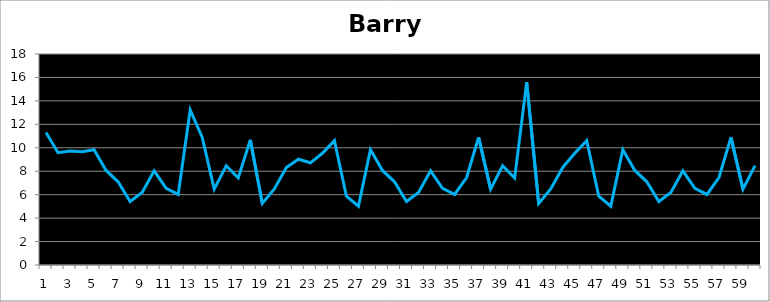
| Category | Barry |
|---|---|
| 0 | 11.312 |
| 1 | 9.582 |
| 2 | 9.734 |
| 3 | 9.655 |
| 4 | 9.84 |
| 5 | 8.066 |
| 6 | 7.099 |
| 7 | 5.417 |
| 8 | 6.193 |
| 9 | 8.037 |
| 10 | 6.54 |
| 11 | 6.018 |
| 12 | 13.222 |
| 13 | 10.888 |
| 14 | 6.469 |
| 15 | 8.474 |
| 16 | 7.427 |
| 17 | 10.676 |
| 18 | 5.253 |
| 19 | 6.486 |
| 20 | 8.319 |
| 21 | 9.023 |
| 22 | 8.718 |
| 23 | 9.53 |
| 24 | 10.608 |
| 25 | 5.869 |
| 26 | 5.018 |
| 27 | 9.84 |
| 28 | 8.066 |
| 29 | 7.099 |
| 30 | 5.417 |
| 31 | 6.193 |
| 32 | 8.037 |
| 33 | 6.54 |
| 34 | 6.018 |
| 35 | 7.462 |
| 36 | 10.888 |
| 37 | 6.469 |
| 38 | 8.474 |
| 39 | 7.427 |
| 40 | 15.598 |
| 41 | 5.253 |
| 42 | 6.486 |
| 43 | 8.319 |
| 44 | 9.53 |
| 45 | 10.608 |
| 46 | 5.869 |
| 47 | 5.018 |
| 48 | 9.84 |
| 49 | 8.066 |
| 50 | 7.099 |
| 51 | 5.417 |
| 52 | 6.193 |
| 53 | 8.037 |
| 54 | 6.54 |
| 55 | 6.018 |
| 56 | 7.462 |
| 57 | 10.888 |
| 58 | 6.469 |
| 59 | 8.474 |